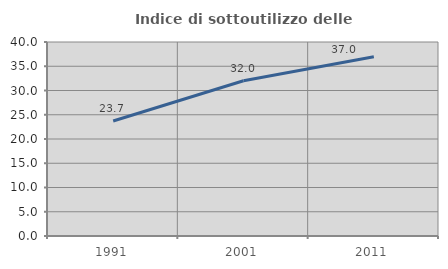
| Category | Indice di sottoutilizzo delle abitazioni  |
|---|---|
| 1991.0 | 23.7 |
| 2001.0 | 32.021 |
| 2011.0 | 36.951 |